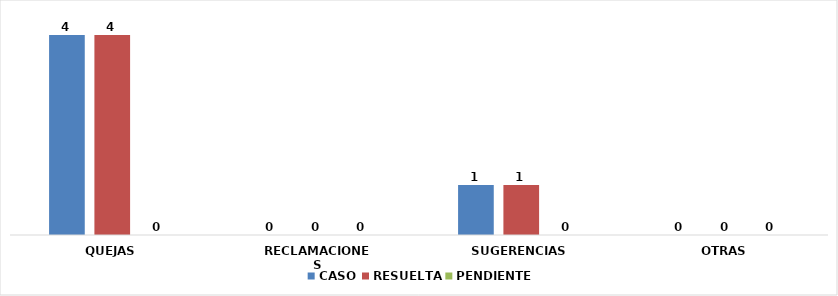
| Category | CASO | RESUELTA | PENDIENTE |
|---|---|---|---|
| QUEJAS | 4 | 4 | 0 |
| RECLAMACIONES | 0 | 0 | 0 |
| SUGERENCIAS | 1 | 1 | 0 |
| OTRAS | 0 | 0 | 0 |